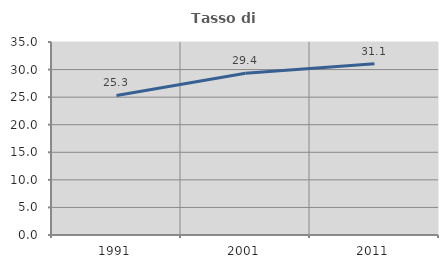
| Category | Tasso di occupazione   |
|---|---|
| 1991.0 | 25.31 |
| 2001.0 | 29.351 |
| 2011.0 | 31.069 |